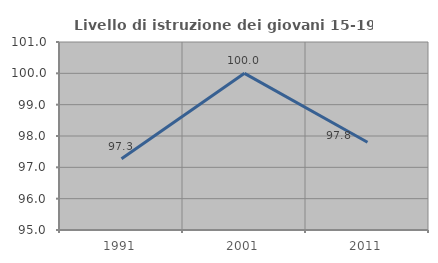
| Category | Livello di istruzione dei giovani 15-19 anni |
|---|---|
| 1991.0 | 97.273 |
| 2001.0 | 100 |
| 2011.0 | 97.802 |